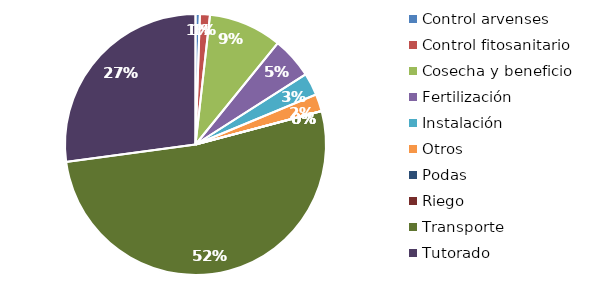
| Category | Valor |
|---|---|
| Control arvenses | 112304 |
| Control fitosanitario | 257980 |
| Cosecha y beneficio | 1891661.102 |
| Fertilización | 1065194 |
| Instalación | 579403.89 |
| Otros | 440947 |
| Podas | 0 |
| Riego | 0 |
| Transporte | 10836868 |
| Tutorado | 5655141 |